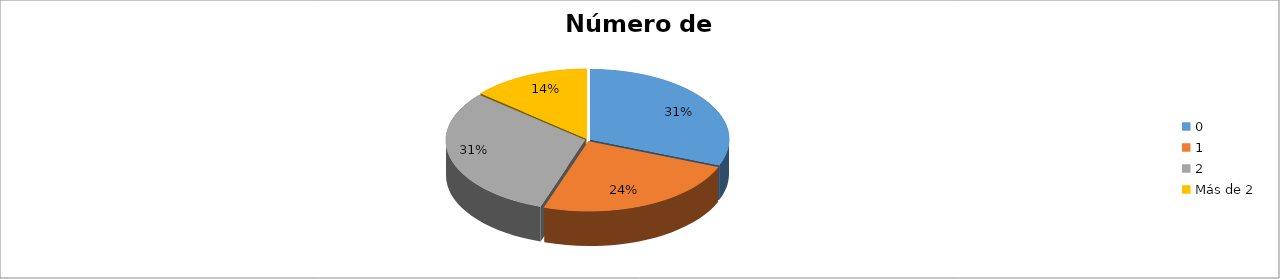
| Category | Series 0 |
|---|---|
| 0 | 0.31 |
| 1 | 0.241 |
| 2 | 0.31 |
| Más de 2 | 0.138 |